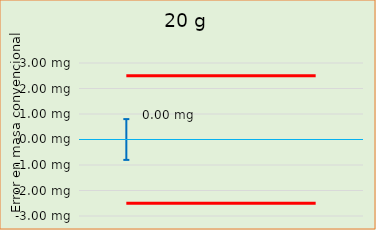
| Category | Error en masa convencional  |  ± EMP |
|---|---|---|
| 0 |  | -2.5 |
| 1 |  | -2.5 |
| 2 |  | -2.5 |